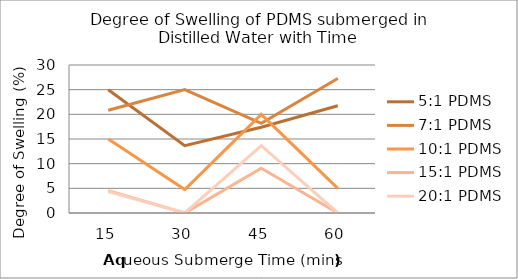
| Category | 5:1 PDMS | 7:1 PDMS | 10:1 PDMS | 15:1 PDMS | 20:1 PDMS |
|---|---|---|---|---|---|
| 0 | 25 | 20.833 | 15 | 4.545 | 4.348 |
| 1 | 13.636 | 25 | 4.762 | 0 | 0 |
| 2 | 17.391 | 18.182 | 20 | 9.091 | 13.636 |
| 3 | 21.739 | 27.273 | 5 | 0 | 0 |